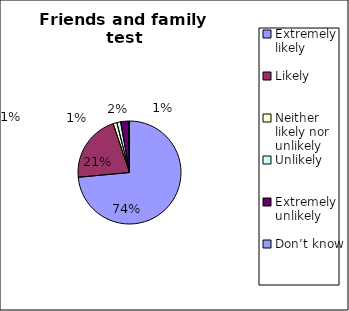
| Category | Series 0 |
|---|---|
| Extremely likely  | 186 |
| Likely  | 54 |
| Neither likely nor unlikely | 3 |
| Unlikely  | 3 |
| Extremely unlikely  | 6 |
| Don’t know  | 1 |